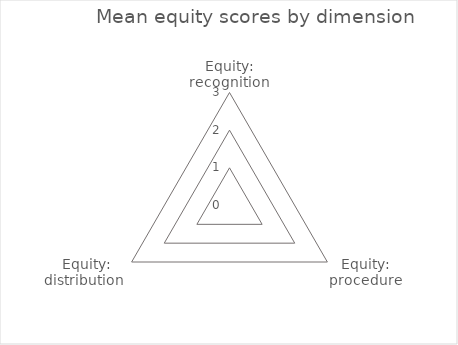
| Category | Mean |
|---|---|
| Equity: recognition | 0 |
| Equity: procedure | 0 |
| Equity: distribution  | 0 |